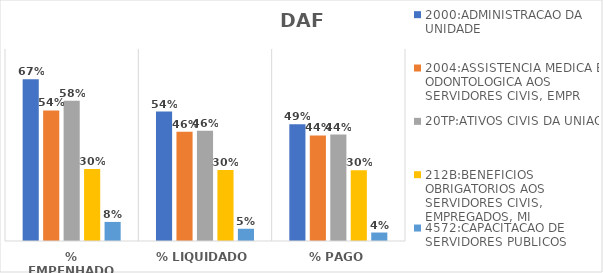
| Category | 2000:ADMINISTRACAO DA UNIDADE | 2004:ASSISTENCIA MEDICA E ODONTOLOGICA AOS SERVIDORES CIVIS, EMPR | 20TP:ATIVOS CIVIS DA UNIAO | 212B:BENEFICIOS OBRIGATORIOS AOS SERVIDORES CIVIS, EMPREGADOS, MI | 4572:CAPACITACAO DE SERVIDORES PUBLICOS FEDERAIS EM PROCESSO DE Q |
|---|---|---|---|---|---|
| % EMPENHADO | 0.674 | 0.544 | 0.584 | 0.3 | 0.08 |
| % LIQUIDADO | 0.54 | 0.456 | 0.46 | 0.296 | 0.051 |
| % PAGO | 0.487 | 0.44 | 0.444 | 0.295 | 0.035 |